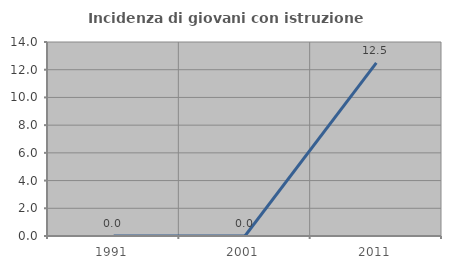
| Category | Incidenza di giovani con istruzione universitaria |
|---|---|
| 1991.0 | 0 |
| 2001.0 | 0 |
| 2011.0 | 12.5 |